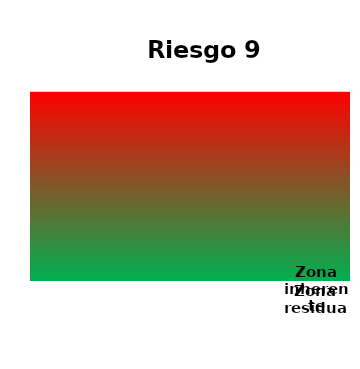
| Category | Zona  | Zona Residual | Zona inherente |
|---|---|---|---|
| Riesgo 9 | 4 | 0 | 0 |